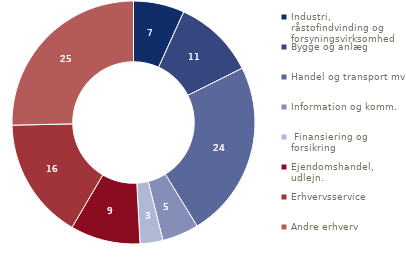
| Category | Series 0 |
|---|---|
| Industri, råstofindvinding og forsyningsvirksomhed | 6.787 |
| Bygge og anlæg | 10.843 |
| Handel og transport mv. | 23.605 |
| Information og komm. | 4.872 |
|  Finansiering og forsikring | 3.034 |
| Ejendomshandel, udlejn. | 9.294 |
| Erhvervsservice | 16.215 |
| Andre erhverv | 25.349 |